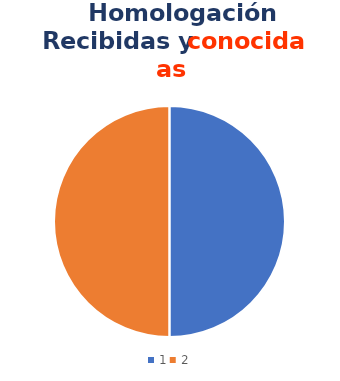
| Category | Series 0 |
|---|---|
| 0 | 1 |
| 1 | 1 |